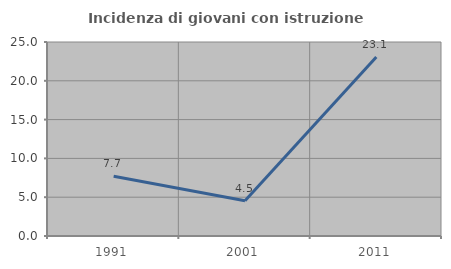
| Category | Incidenza di giovani con istruzione universitaria |
|---|---|
| 1991.0 | 7.692 |
| 2001.0 | 4.545 |
| 2011.0 | 23.077 |